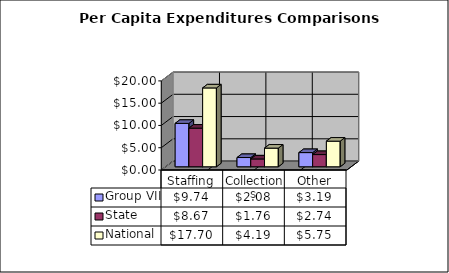
| Category | Group VII | State | National |
|---|---|---|---|
| Staffing | 9.737 | 8.673 | 17.7 |
| Collections | 2.077 | 1.759 | 4.19 |
| Other | 3.187 | 2.74 | 5.75 |